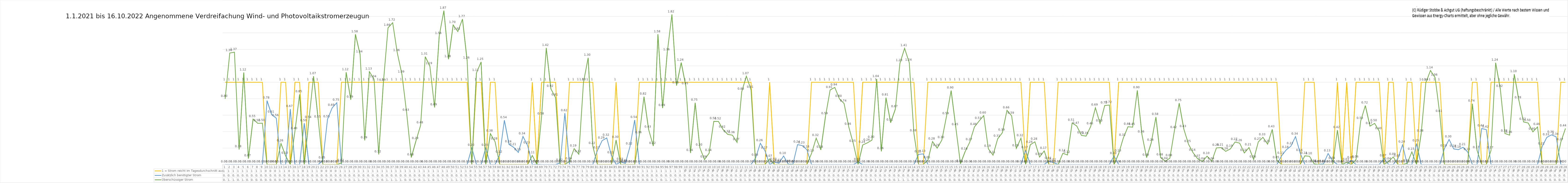
| Category | 1 = Strom reicht im Tagesdurchschnitt aus | Zusätzlich benötigter Strom | Überschüssiger Strom |
|---|---|---|---|
| 0 | 1 | 0 | 0.798 |
| 1 | 1 | 0 | 1.356 |
| 2 | 1 | 0 | 1.366 |
| 3 | 1 | 0 | 0.184 |
| 4 | 1 | 0 | 1.118 |
| 5 | 1 | 0 | 0.073 |
| 6 | 1 | 0 | 0.553 |
| 7 | 1 | 0 | 0.501 |
| 8 | 1 | 0 | 0.503 |
| 9 | 0 | 0.777 | 0 |
| 10 | 0 | 0.606 | 0 |
| 11 | 0 | 0.563 | 0 |
| 12 | 1 | 0 | 0.255 |
| 13 | 1 | 0 | 0.104 |
| 14 | 0 | 0.673 | 0 |
| 15 | 1 | 0 | 0.405 |
| 16 | 1 | 0 | 0.852 |
| 17 | 0 | 0.502 | 0 |
| 18 | 1 | 0 | 0.54 |
| 19 | 1 | 0 | 1.074 |
| 20 | 1 | 0 | 0.546 |
| 21 | 0 | 0.048 | 0 |
| 22 | 0 | 0.55 | 0 |
| 23 | 0 | 0.688 | 0 |
| 24 | 0 | 0.751 | 0 |
| 25 | 1 | 0 | 0.018 |
| 26 | 1 | 0 | 1.121 |
| 27 | 1 | 0 | 0.788 |
| 28 | 1 | 0 | 1.583 |
| 29 | 1 | 0 | 1.338 |
| 30 | 1 | 0 | 0.293 |
| 31 | 1 | 0 | 1.13 |
| 32 | 1 | 0 | 1.037 |
| 33 | 1 | 0 | 0.123 |
| 34 | 1 | 0 | 0.992 |
| 35 | 1 | 0 | 1.662 |
| 36 | 1 | 0 | 1.724 |
| 37 | 1 | 0 | 1.355 |
| 38 | 1 | 0 | 1.094 |
| 39 | 1 | 0 | 0.628 |
| 40 | 1 | 0 | 0.085 |
| 41 | 1 | 0 | 0.286 |
| 42 | 1 | 0 | 0.476 |
| 43 | 1 | 0 | 1.311 |
| 44 | 1 | 0 | 1.194 |
| 45 | 1 | 0 | 0.694 |
| 46 | 1 | 0 | 1.563 |
| 47 | 1 | 0 | 1.87 |
| 48 | 1 | 0 | 1.28 |
| 49 | 1 | 0 | 1.697 |
| 50 | 1 | 0 | 1.616 |
| 51 | 1 | 0 | 1.767 |
| 52 | 1 | 0 | 1.264 |
| 53 | 0 | 0.202 | 0 |
| 54 | 1 | 0 | 1.112 |
| 55 | 1 | 0 | 1.247 |
| 56 | 0 | 0.202 | 0 |
| 57 | 1 | 0 | 0.376 |
| 58 | 1 | 0 | 0.278 |
| 59 | 0 | 0.118 | 0 |
| 60 | 0 | 0.538 | 0 |
| 61 | 0 | 0.244 | 0 |
| 62 | 0 | 0.209 | 0 |
| 63 | 0 | 0.147 | 0 |
| 64 | 0 | 0.341 | 0 |
| 65 | 0 | 0.231 | 0 |
| 66 | 1 | 0 | 0.11 |
| 67 | 0 | 0.003 | 0 |
| 68 | 1 | 0 | 0.584 |
| 69 | 1 | 0 | 1.417 |
| 70 | 1 | 0 | 0.92 |
| 71 | 1 | 0 | 0.813 |
| 72 | 0 | 0.019 | 0 |
| 73 | 0 | 0.624 | 0 |
| 74 | 1 | 0 | 0.038 |
| 75 | 1 | 0 | 0.193 |
| 76 | 1 | 0 | 0.125 |
| 77 | 1 | 0 | 0.999 |
| 78 | 1 | 0 | 1.297 |
| 79 | 1 | 0 | 0.224 |
| 80 | 0 | 0.171 | 0 |
| 81 | 0 | 0.289 | 0 |
| 82 | 0 | 0.323 | 0 |
| 83 | 0 | 0.11 | 0 |
| 84 | 1 | 0 | 0.298 |
| 85 | 0 | 0.032 | 0 |
| 86 | 0 | 0.013 | 0 |
| 87 | 0 | 0.22 | 0 |
| 88 | 0 | 0.541 | 0 |
| 89 | 1 | 0 | 0.357 |
| 90 | 1 | 0 | 0.825 |
| 91 | 1 | 0 | 0.425 |
| 92 | 1 | 0 | 0.225 |
| 93 | 1 | 0 | 1.583 |
| 94 | 1 | 0 | 0.686 |
| 95 | 1 | 0 | 1.361 |
| 96 | 1 | 0 | 1.824 |
| 97 | 1 | 0 | 0.96 |
| 98 | 1 | 0 | 1.239 |
| 99 | 1 | 0 | 0.951 |
| 100 | 1 | 0 | 0.14 |
| 101 | 1 | 0 | 0.751 |
| 102 | 1 | 0 | 0.205 |
| 103 | 1 | 0 | 0.06 |
| 104 | 1 | 0 | 0.138 |
| 105 | 1 | 0 | 0.525 |
| 106 | 1 | 0 | 0.524 |
| 107 | 1 | 0 | 0.425 |
| 108 | 1 | 0 | 0.366 |
| 109 | 1 | 0 | 0.357 |
| 110 | 1 | 0 | 0.269 |
| 111 | 1 | 0 | 0.884 |
| 112 | 1 | 0 | 1.074 |
| 113 | 1 | 0 | 0.908 |
| 114 | 0 | 0.082 | 0 |
| 115 | 0 | 0.258 | 0 |
| 116 | 0 | 0.168 | 0 |
| 117 | 1 | 0 | 0.068 |
| 118 | 0 | 0.031 | 0 |
| 119 | 0 | 0.016 | 0 |
| 120 | 0 | 0.104 | 0 |
| 121 | 0 | 0.005 | 0 |
| 122 | 0 | 0.003 | 0 |
| 123 | 0 | 0.242 | 0 |
| 124 | 0 | 0.23 | 0 |
| 125 | 0 | 0.181 | 0 |
| 126 | 1 | 0 | 0.134 |
| 127 | 1 | 0 | 0.321 |
| 128 | 1 | 0 | 0.178 |
| 129 | 1 | 0 | 0.585 |
| 130 | 1 | 0 | 0.906 |
| 131 | 1 | 0 | 0.937 |
| 132 | 1 | 0 | 0.798 |
| 133 | 1 | 0 | 0.741 |
| 134 | 1 | 0 | 0.458 |
| 135 | 1 | 0 | 0.25 |
| 136 | 0 | 0.03 | 0 |
| 137 | 1 | 0 | 0.238 |
| 138 | 1 | 0 | 0.263 |
| 139 | 1 | 0 | 0.298 |
| 140 | 1 | 0 | 1.04 |
| 141 | 1 | 0 | 0.161 |
| 142 | 1 | 0 | 0.812 |
| 143 | 1 | 0 | 0.509 |
| 144 | 1 | 0 | 0.672 |
| 145 | 1 | 0 | 1.232 |
| 146 | 1 | 0 | 1.413 |
| 147 | 1 | 0 | 1.238 |
| 148 | 1 | 0 | 0.379 |
| 149 | 0 | 0.123 | 0 |
| 150 | 0 | 0.129 | 0 |
| 151 | 1 | 0 | 0.052 |
| 152 | 1 | 0 | 0.279 |
| 153 | 1 | 0 | 0.199 |
| 154 | 1 | 0 | 0.296 |
| 155 | 1 | 0 | 0.585 |
| 156 | 1 | 0 | 0.899 |
| 157 | 1 | 0 | 0.452 |
| 158 | 1 | 0 | 0.009 |
| 159 | 1 | 0 | 0.156 |
| 160 | 1 | 0 | 0.272 |
| 161 | 1 | 0 | 0.456 |
| 162 | 1 | 0 | 0.528 |
| 163 | 1 | 0 | 0.595 |
| 164 | 1 | 0 | 0.191 |
| 165 | 1 | 0 | 0.114 |
| 166 | 1 | 0 | 0.312 |
| 167 | 1 | 0 | 0.386 |
| 168 | 1 | 0 | 0.659 |
| 169 | 1 | 0 | 0.592 |
| 170 | 1 | 0 | 0.196 |
| 171 | 1 | 0 | 0.32 |
| 172 | 0 | 0.174 | 0 |
| 173 | 1 | 0 | 0.24 |
| 174 | 1 | 0 | 0.276 |
| 175 | 1 | 0 | 0.09 |
| 176 | 1 | 0 | 0.165 |
| 177 | 0 | 0.041 | 0 |
| 178 | 0 | 0.023 | 0 |
| 179 | 1 | 0 | 0 |
| 180 | 1 | 0 | 0.136 |
| 181 | 1 | 0 | 0.116 |
| 182 | 1 | 0 | 0.505 |
| 183 | 1 | 0 | 0.468 |
| 184 | 1 | 0 | 0.354 |
| 185 | 1 | 0 | 0.345 |
| 186 | 1 | 0 | 0.464 |
| 187 | 1 | 0 | 0.69 |
| 188 | 1 | 0 | 0.498 |
| 189 | 1 | 0 | 0.717 |
| 190 | 1 | 0 | 0.723 |
| 191 | 0 | 0.104 | 0 |
| 192 | 1 | 0 | 0.132 |
| 193 | 1 | 0 | 0.323 |
| 194 | 1 | 0 | 0.459 |
| 195 | 1 | 0 | 0.454 |
| 196 | 1 | 0 | 0.901 |
| 197 | 1 | 0 | 0.364 |
| 198 | 1 | 0 | 0.084 |
| 199 | 1 | 0 | 0.264 |
| 200 | 1 | 0 | 0.577 |
| 201 | 1 | 0 | 0.085 |
| 202 | 1 | 0 | 0.039 |
| 203 | 1 | 0 | 0.077 |
| 204 | 1 | 0 | 0.418 |
| 205 | 1 | 0 | 0.746 |
| 206 | 1 | 0 | 0.431 |
| 207 | 1 | 0 | 0.247 |
| 208 | 1 | 0 | 0.142 |
| 209 | 1 | 0 | 0.068 |
| 210 | 1 | 0 | 0.037 |
| 211 | 1 | 0 | 0.102 |
| 212 | 1 | 0 | 0.038 |
| 213 | 1 | 0 | 0.202 |
| 214 | 1 | 0 | 0.206 |
| 215 | 1 | 0 | 0.16 |
| 216 | 1 | 0 | 0.19 |
| 217 | 1 | 0 | 0.274 |
| 218 | 1 | 0 | 0.26 |
| 219 | 1 | 0 | 0.14 |
| 220 | 1 | 0 | 0.206 |
| 221 | 1 | 0 | 0.061 |
| 222 | 1 | 0 | 0.275 |
| 223 | 1 | 0 | 0.331 |
| 224 | 1 | 0 | 0.247 |
| 225 | 1 | 0 | 0.427 |
| 226 | 1 | 0 | 0.051 |
| 227 | 0 | 0.105 | 0 |
| 228 | 0 | 0.177 | 0 |
| 229 | 0 | 0.223 | 0 |
| 230 | 0 | 0.339 | 0 |
| 231 | 0 | 0.139 | 0 |
| 232 | 1 | 0 | 0.105 |
| 233 | 1 | 0 | 0.1 |
| 234 | 1 | 0 | 0.009 |
| 235 | 0 | 0.004 | 0 |
| 236 | 0 | 0.007 | 0 |
| 237 | 0 | 0.133 | 0 |
| 238 | 0 | 0.044 | 0 |
| 239 | 1 | 0 | 0.418 |
| 240 | 0 | 0.001 | 0 |
| 241 | 1 | 0 | 0.028 |
| 242 | 0 | 0.05 | 0 |
| 243 | 1 | 0 | 0.059 |
| 244 | 1 | 0 | 0.528 |
| 245 | 1 | 0 | 0.716 |
| 246 | 1 | 0 | 0.467 |
| 247 | 1 | 0 | 0.5 |
| 248 | 1 | 0 | 0.404 |
| 249 | 0 | 0.074 | 0 |
| 250 | 1 | 0 | 0.037 |
| 251 | 1 | 0 | 0.092 |
| 252 | 0 | 0.073 | 0 |
| 253 | 0 | 0.24 | 0 |
| 254 | 1 | 0 | 0.014 |
| 255 | 1 | 0 | 0.154 |
| 256 | 0 | 0.255 | 0 |
| 257 | 1 | 0 | 0.376 |
| 258 | 1 | 0 | 0.994 |
| 259 | 1 | 0 | 1.143 |
| 260 | 1 | 0 | 1.055 |
| 261 | 1 | 0 | 0.613 |
| 262 | 0 | 0.194 | 0 |
| 263 | 0 | 0.304 | 0 |
| 264 | 0 | 0.19 | 0 |
| 265 | 0 | 0.18 | 0 |
| 266 | 0 | 0.209 | 0 |
| 267 | 0 | 0.152 | 0 |
| 268 | 1 | 0 | 0.738 |
| 269 | 1 | 0 | 0.175 |
| 270 | 0 | 0.438 | 0 |
| 271 | 0 | 0.424 | 0 |
| 272 | 1 | 0 | 0.17 |
| 273 | 1 | 0 | 1.237 |
| 274 | 1 | 0 | 0.92 |
| 275 | 1 | 0 | 0.377 |
| 276 | 1 | 0 | 0.358 |
| 277 | 1 | 0 | 1.098 |
| 278 | 1 | 0 | 0.778 |
| 279 | 1 | 0 | 0.518 |
| 280 | 1 | 0 | 0.504 |
| 281 | 1 | 0 | 0.397 |
| 282 | 1 | 0 | 0.456 |
| 283 | 0 | 0.219 | 0 |
| 284 | 0 | 0.33 | 0 |
| 285 | 0 | 0.36 | 0 |
| 286 | 0 | 0.337 | 0 |
| 287 | 1 | 0 | 0.271 |
| 288 | 1 | 0 | 0.438 |